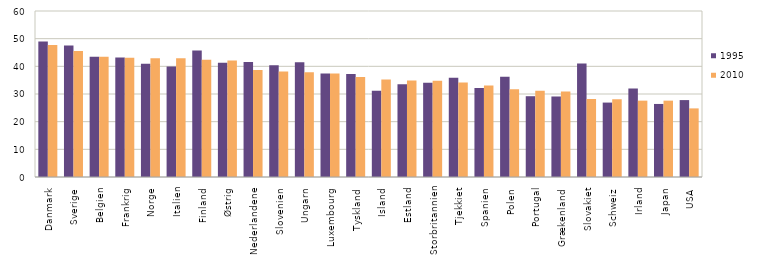
| Category | 1995 | 2010 |
|---|---|---|
| Danmark | 49 | 47.7 |
| Sverige | 47.5 | 45.5 |
| Belgien | 43.5 | 43.5 |
| Frankrig | 43.2 | 43.1 |
| Norge | 40.9 | 42.9 |
| Italien | 39.9 | 42.9 |
| Finland | 45.7 | 42.4 |
| Østrig | 41.3 | 42.1 |
| Nederlandene | 41.6 | 38.7 |
| Slovenien | 40.4 | 38.1 |
| Ungarn | 41.5 | 37.9 |
| Luxembourg | 37.4 | 37.4 |
| Tyskland | 37.2 | 36.1 |
| Island | 31.2 | 35.2 |
| Estland | 33.5 | 34.9 |
| Storbritannien | 34.1 | 34.8 |
| Tjekkiet | 35.9 | 34.2 |
| Spanien | 32.2 | 33.1 |
| Polen | 36.2 | 31.7 |
| Portugal | 29.2 | 31.2 |
| Grækenland | 29.1 | 30.9 |
| Slovakiet | 41 | 28.2 |
| Schweiz | 26.9 | 28.1 |
| Irland | 32 | 27.6 |
| Japan | 26.4 | 27.6 |
| USA | 27.8 | 24.8 |